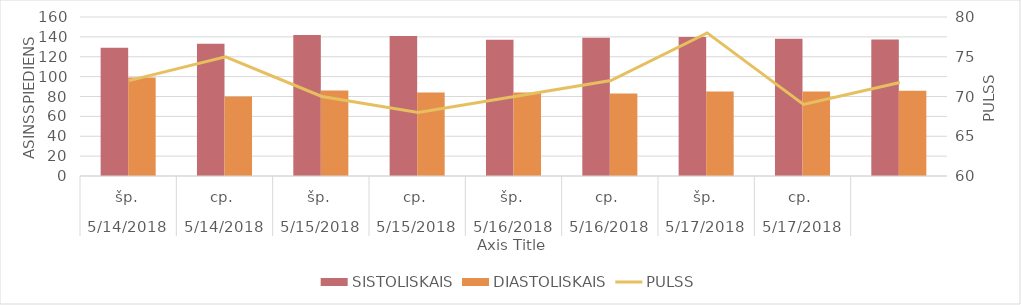
| Category | SISTOLISKAIS | DIASTOLISKAIS |
|---|---|---|
| 0 | 129 | 99 |
| 1/1/00 | 133 | 80 |
| 1/2/00 | 142 | 86 |
| 1/3/00 | 141 | 84 |
| 1/4/00 | 137 | 84 |
| 1/5/00 | 139 | 83 |
| 1/6/00 | 140 | 85 |
| 1/7/00 | 138 | 85 |